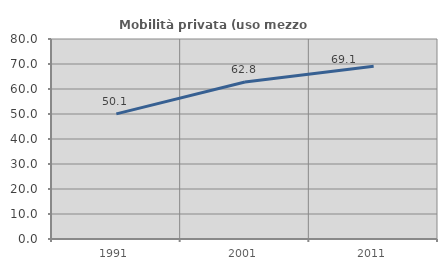
| Category | Mobilità privata (uso mezzo privato) |
|---|---|
| 1991.0 | 50.055 |
| 2001.0 | 62.803 |
| 2011.0 | 69.083 |